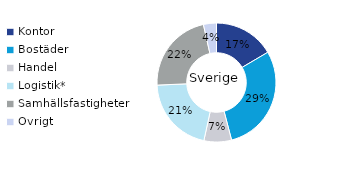
| Category | Sverige |
|---|---|
| Kontor | 0.165 |
| Bostäder | 0.294 |
| Handel | 0.075 |
| Logistik* | 0.209 |
| Samhällsfastigheter | 0.222 |
| Övrigt | 0.035 |